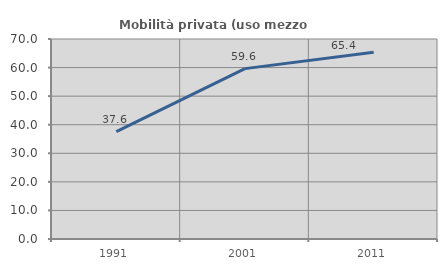
| Category | Mobilità privata (uso mezzo privato) |
|---|---|
| 1991.0 | 37.609 |
| 2001.0 | 59.629 |
| 2011.0 | 65.37 |